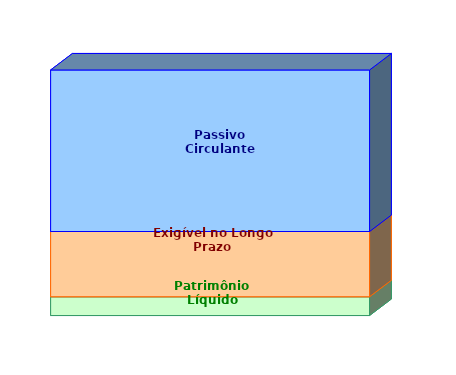
| Category | Patrimônio Líquido | Exigível no Longo Prazo | Passivo Circulante |
|---|---|---|---|
| 0 | 0.077 | 0.266 | 0.658 |